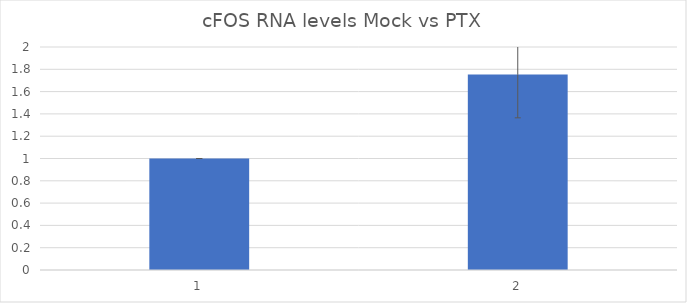
| Category | Series 0 |
|---|---|
| 0 | 1 |
| 1 | 1.752 |